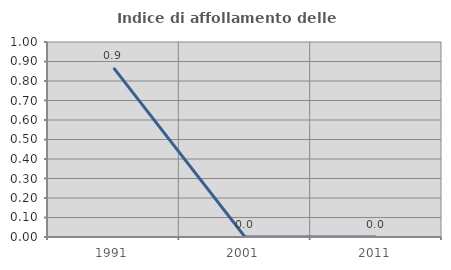
| Category | Indice di affollamento delle abitazioni  |
|---|---|
| 1991.0 | 0.867 |
| 2001.0 | 0 |
| 2011.0 | 0 |